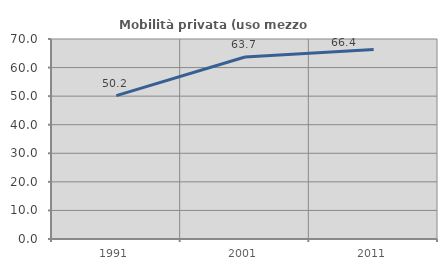
| Category | Mobilità privata (uso mezzo privato) |
|---|---|
| 1991.0 | 50.178 |
| 2001.0 | 63.704 |
| 2011.0 | 66.352 |